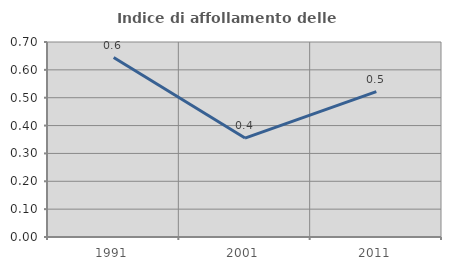
| Category | Indice di affollamento delle abitazioni  |
|---|---|
| 1991.0 | 0.644 |
| 2001.0 | 0.355 |
| 2011.0 | 0.522 |